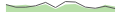
| Category | Series 1 |
|---|---|
| 0 | 62 |
| 1 | 40 |
| 2 | 40 |
| 3 | 52 |
| 4 | 80 |
| 5 | 37 |
| 6 | 87 |
| 7 | 83 |
| 8 | 41 |
| 9 | 31 |
| 10 | 48 |
| 11 | 29 |